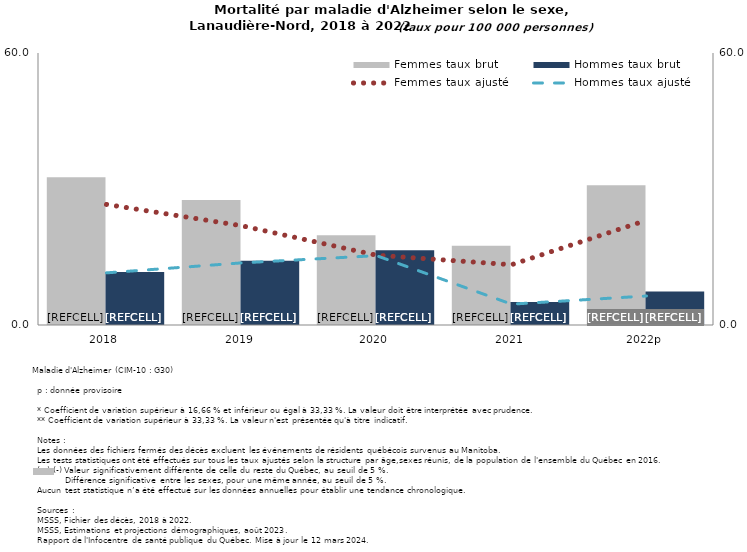
| Category | Femmes taux brut | Hommes taux brut |
|---|---|---|
| 2018 | 32.6 | 11.7 |
| 2019 | 27.6 | 14.2 |
| 2020 | 19.8 | 16.5 |
| 2021 | 17.5 | 5.1 |
| 2022p | 30.8 | 7.4 |